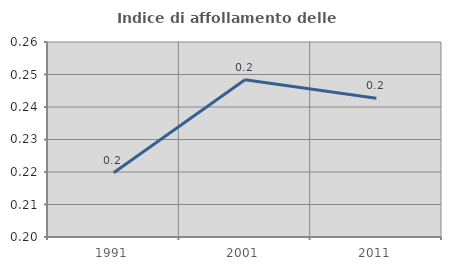
| Category | Indice di affollamento delle abitazioni  |
|---|---|
| 1991.0 | 0.22 |
| 2001.0 | 0.248 |
| 2011.0 | 0.243 |